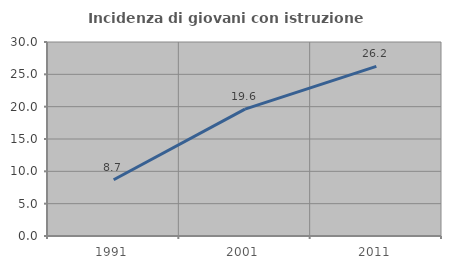
| Category | Incidenza di giovani con istruzione universitaria |
|---|---|
| 1991.0 | 8.696 |
| 2001.0 | 19.626 |
| 2011.0 | 26.23 |